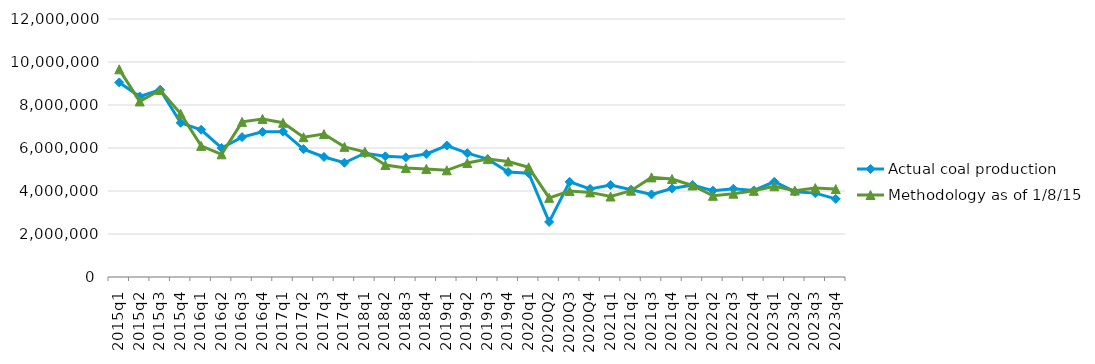
| Category | Actual coal production | Methodology as of 1/8/15 |
|---|---|---|
| 2015q1 | 9049591 | 9659160 |
| 2015q2 | 8396251 | 8166351 |
| 2015q3 | 8706595 | 8695417 |
| 2015q4 | 7171565 | 7593772 |
| 2016q1 | 6848223 | 6098719 |
| 2016q2 | 6002308 | 5705589 |
| 2016q3 | 6508337 | 7215534 |
| 2016q4 | 6750187 | 7352446 |
| 2017q1 | 6759704 | 7173117 |
| 2017q2 | 5948923 | 6501271 |
| 2017q3 | 5583324 | 6646786 |
| 2017q4 | 5313607 | 6054045 |
| 2018q1 | 5757753 | 5824251 |
| 2018q2 | 5611408 | 5209403 |
| 2018q3 | 5566036 | 5065331 |
| 2018q4 | 5723927 | 5026881 |
| 2019q1 | 6114327 | 4962410 |
| 2019q2 | 5760256 | 5304264 |
| 2019q3 | 5481282 | 5482698 |
| 2019q4 | 4884272 | 5371689 |
| 2020q1 | 4825923 | 5100730 |
| 2020Q2 | 2562103 | 3680384 |
| 2020Q3 | 4424915 | 4000169 |
| 2020Q4 | 4098927 | 3935523 |
| 2021q1 | 4278043 | 3742962 |
| 2021q2 | 4059665 | 4013900 |
| 2021q3 | 3839326 | 4632752 |
| 2021q4 | 4119150 | 4559211 |
| 2022q1 | 4279989 | 4257877 |
| 2022q2 | 4017548 | 3776667 |
| 2022q3 | 4105715 | 3875212 |
| 2022q4 | 4026604 | 4007574 |
| 2023q1 | 4429858 | 4220817 |
| 2023q2 | 3968994 | 4017688 |
| 2023q3 | 3901458 | 4135610 |
| 2023q4 | 3632768 | 4089591 |